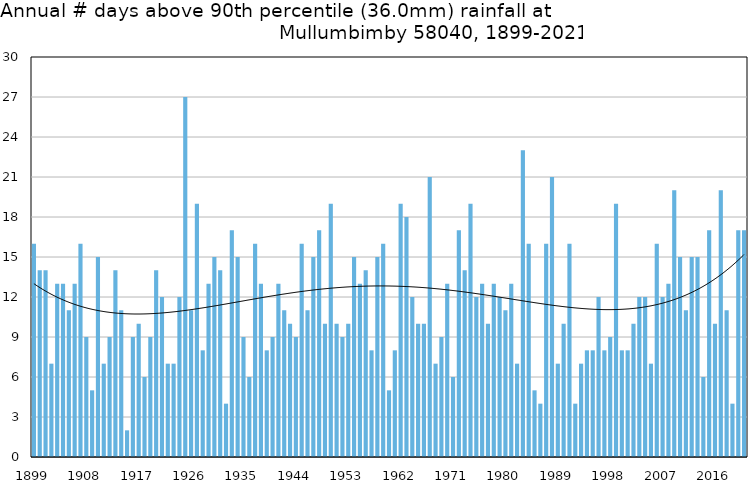
| Category | Annual # days above 90th percentile |
|---|---|
| 1899 | 16 |
| 1900 | 14 |
| 1901 | 14 |
| 1902 | 7 |
| 1903 | 13 |
| 1904 | 13 |
| 1905 | 11 |
| 1906 | 13 |
| 1907 | 16 |
| 1908 | 9 |
| 1909 | 5 |
| 1910 | 15 |
| 1911 | 7 |
| 1912 | 9 |
| 1913 | 14 |
| 1914 | 11 |
| 1915 | 2 |
| 1916 | 9 |
| 1917 | 10 |
| 1918 | 6 |
| 1919 | 9 |
| 1920 | 14 |
| 1921 | 12 |
| 1922 | 7 |
| 1923 | 7 |
| 1924 | 12 |
| 1925 | 27 |
| 1926 | 11 |
| 1927 | 19 |
| 1928 | 8 |
| 1929 | 13 |
| 1930 | 15 |
| 1931 | 14 |
| 1932 | 4 |
| 1933 | 17 |
| 1934 | 15 |
| 1935 | 9 |
| 1936 | 6 |
| 1937 | 16 |
| 1938 | 13 |
| 1939 | 8 |
| 1940 | 9 |
| 1941 | 13 |
| 1942 | 11 |
| 1943 | 10 |
| 1944 | 9 |
| 1945 | 16 |
| 1946 | 11 |
| 1947 | 15 |
| 1948 | 17 |
| 1949 | 10 |
| 1950 | 19 |
| 1951 | 10 |
| 1952 | 9 |
| 1953 | 10 |
| 1954 | 15 |
| 1955 | 13 |
| 1956 | 14 |
| 1957 | 8 |
| 1958 | 15 |
| 1959 | 16 |
| 1960 | 5 |
| 1961 | 8 |
| 1962 | 19 |
| 1963 | 18 |
| 1964 | 12 |
| 1965 | 10 |
| 1966 | 10 |
| 1967 | 21 |
| 1968 | 7 |
| 1969 | 9 |
| 1970 | 13 |
| 1971 | 6 |
| 1972 | 17 |
| 1973 | 14 |
| 1974 | 19 |
| 1975 | 12 |
| 1976 | 13 |
| 1977 | 10 |
| 1978 | 13 |
| 1979 | 12 |
| 1980 | 11 |
| 1981 | 13 |
| 1982 | 7 |
| 1983 | 23 |
| 1984 | 16 |
| 1985 | 5 |
| 1986 | 4 |
| 1987 | 16 |
| 1988 | 21 |
| 1989 | 7 |
| 1990 | 10 |
| 1991 | 16 |
| 1992 | 4 |
| 1993 | 7 |
| 1994 | 8 |
| 1995 | 8 |
| 1996 | 12 |
| 1997 | 8 |
| 1998 | 9 |
| 1999 | 19 |
| 2000 | 8 |
| 2001 | 8 |
| 2002 | 10 |
| 2003 | 12 |
| 2004 | 12 |
| 2005 | 7 |
| 2006 | 16 |
| 2007 | 12 |
| 2008 | 13 |
| 2009 | 20 |
| 2010 | 15 |
| 2011 | 11 |
| 2012 | 15 |
| 2013 | 15 |
| 2014 | 6 |
| 2015 | 17 |
| 2016 | 10 |
| 2017 | 20 |
| 2018 | 11 |
| 2019 | 4 |
| 2020 | 17 |
| 2021 | 17 |